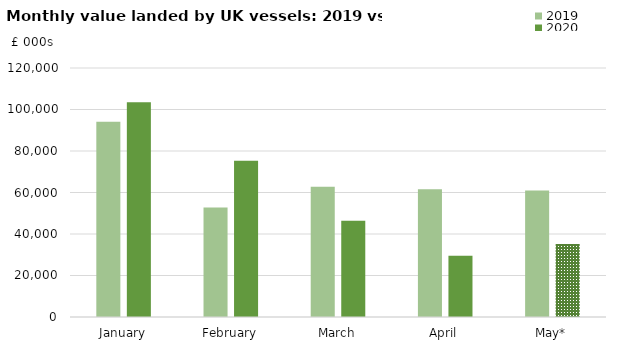
| Category | 2019 | 2020 |
|---|---|---|
| January | 94042.306 | 103450.405 |
| February | 52760.804 | 75246.385 |
| March | 62716.944 | 46330.99 |
| April | 61571.765 | 29463.056 |
| May* | 60965.541 | 35127.78 |